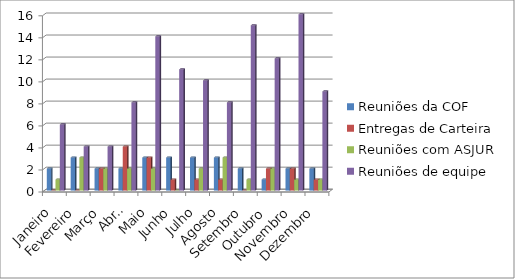
| Category | Reuniões da COF | Entregas de Carteira | Reuniões com ASJUR | Reuniões de equipe |
|---|---|---|---|---|
| Janeiro | 2 | 0 | 1 | 6 |
| Fevereiro | 3 | 0 | 3 | 4 |
| Março | 2 | 2 | 2 | 4 |
| Abril | 2 | 4 | 2 | 8 |
| Maio | 3 | 3 | 2 | 14 |
| Junho | 3 | 1 | 0 | 11 |
| Julho | 3 | 1 | 2 | 10 |
| Agosto | 3 | 1 | 3 | 8 |
| Setembro | 2 | 0 | 1 | 15 |
| Outubro | 1 | 2 | 2 | 12 |
| Novembro | 2 | 2 | 1 | 16 |
| Dezembro | 2 | 1 | 1 | 9 |